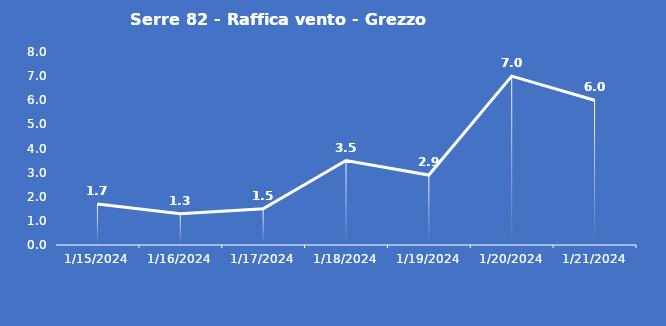
| Category | Serre 82 - Raffica vento - Grezzo (m/s) |
|---|---|
| 1/15/24 | 1.7 |
| 1/16/24 | 1.3 |
| 1/17/24 | 1.5 |
| 1/18/24 | 3.5 |
| 1/19/24 | 2.9 |
| 1/20/24 | 7 |
| 1/21/24 | 6 |